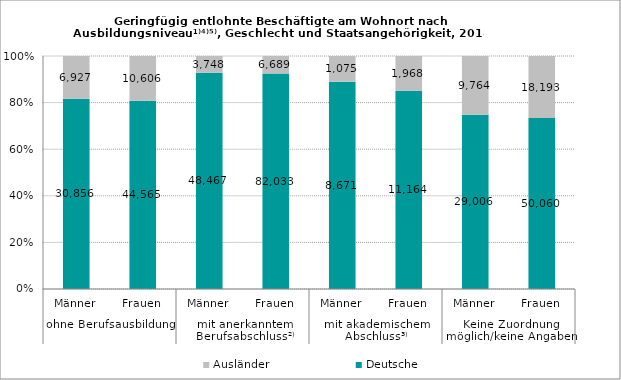
| Category | Deutsche | Ausländer |
|---|---|---|
| 0 | 30856 | 6927 |
| 1 | 44565 | 10606 |
| 2 | 48467 | 3748 |
| 3 | 82033 | 6689 |
| 4 | 8671 | 1075 |
| 5 | 11164 | 1968 |
| 6 | 29006 | 9764 |
| 7 | 50060 | 18193 |